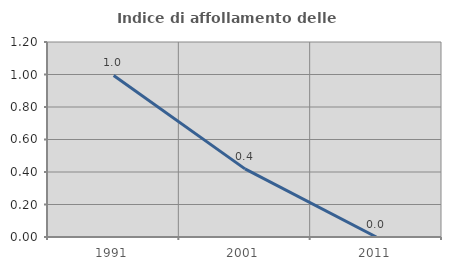
| Category | Indice di affollamento delle abitazioni  |
|---|---|
| 1991.0 | 0.994 |
| 2001.0 | 0.419 |
| 2011.0 | 0 |